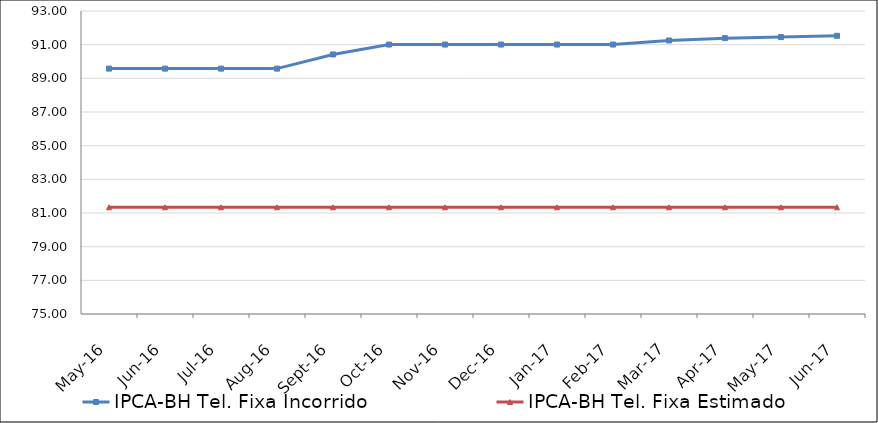
| Category | IPCA-BH Tel. Fixa Incorrido | IPCA-BH Tel. Fixa Estimado |
|---|---|---|
| 2016-05-01 | 89.577 | 81.34 |
| 2016-06-01 | 89.577 | 81.34 |
| 2016-07-01 | 89.577 | 81.34 |
| 2016-08-01 | 89.577 | 81.34 |
| 2016-09-01 | 90.419 | 81.34 |
| 2016-10-01 | 91.007 | 81.34 |
| 2016-11-01 | 91.007 | 81.34 |
| 2016-12-01 | 91.007 | 81.34 |
| 2017-01-01 | 91.007 | 81.34 |
| 2017-02-01 | 91.007 | 81.34 |
| 2017-03-01 | 91.248 | 81.34 |
| 2017-04-01 | 91.387 | 81.34 |
| 2017-05-01 | 91.451 | 81.34 |
| 2017-06-01 | 91.525 | 81.34 |